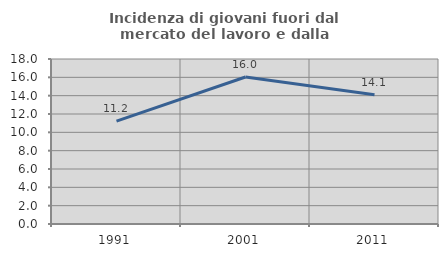
| Category | Incidenza di giovani fuori dal mercato del lavoro e dalla formazione  |
|---|---|
| 1991.0 | 11.231 |
| 2001.0 | 16.04 |
| 2011.0 | 14.098 |